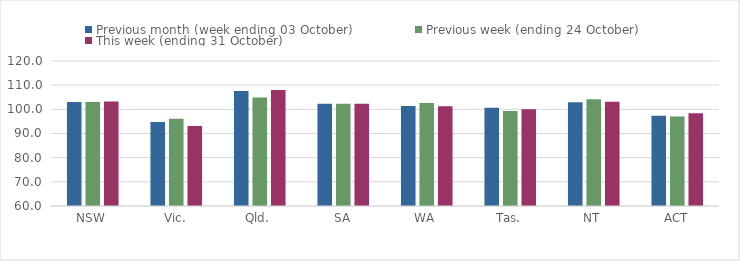
| Category | Previous month (week ending 03 October) | Previous week (ending 24 October) | This week (ending 31 October) |
|---|---|---|---|
| NSW | 103.01 | 103.01 | 103.2 |
| Vic. | 94.77 | 96.14 | 93.08 |
| Qld. | 107.57 | 104.87 | 107.97 |
| SA | 102.3 | 102.3 | 102.3 |
| WA | 101.4 | 102.66 | 101.23 |
| Tas. | 100.66 | 99.29 | 100.03 |
| NT | 102.89 | 104.19 | 103.13 |
| ACT | 97.38 | 97.04 | 98.35 |